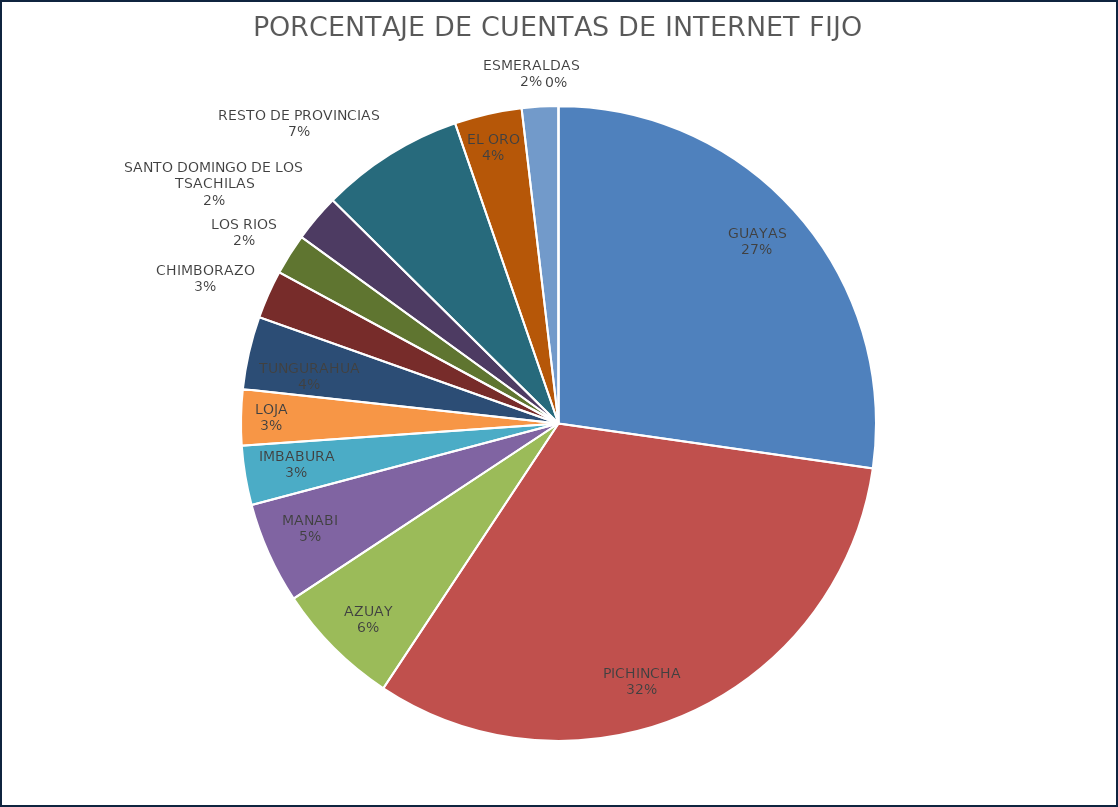
| Category | PORCENTAJE DE CUENTAS DE INTERNET FIJO |
|---|---|
| GUAYAS | 0.268 |
| PICHINCHA | 0.315 |
| AZUAY | 0.063 |
| MANABI | 0.051 |
| IMBABURA | 0.03 |
| LOJA | 0.028 |
| TUNGURAHUA | 0.036 |
| CHIMBORAZO | 0.024 |
| LOS RIOS | 0.021 |
| SANTO DOMINGO DE LOS TSACHILAS | 0.024 |
| RESTO DE PROVINCIAS | 0.072 |
| EL ORO | 0.034 |
| ESMERALDAS | 0.018 |